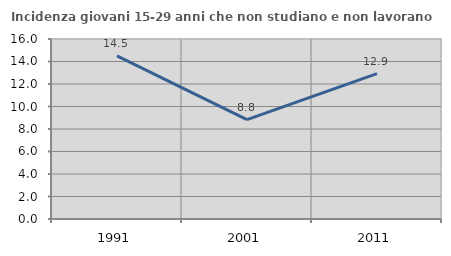
| Category | Incidenza giovani 15-29 anni che non studiano e non lavorano  |
|---|---|
| 1991.0 | 14.505 |
| 2001.0 | 8.833 |
| 2011.0 | 12.926 |